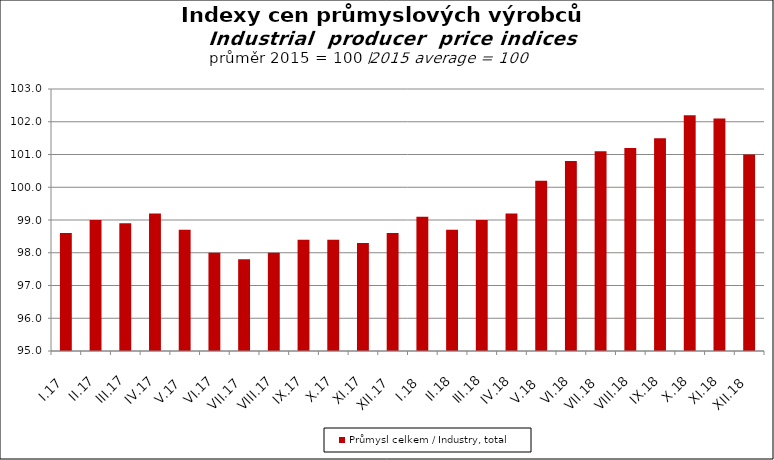
| Category | Průmysl celkem / Industry, total |
|---|---|
| I.17 | 98.6 |
| II.17 | 99 |
| III.17 | 98.9 |
| IV.17 | 99.2 |
| V.17 | 98.7 |
| VI.17 | 98 |
| VII.17 | 97.8 |
| VIII.17 | 98 |
| IX.17 | 98.4 |
| X.17 | 98.4 |
| XI.17 | 98.3 |
| XII.17 | 98.6 |
| I.18 | 99.1 |
| II.18 | 98.7 |
| III.18 | 99 |
| IV.18 | 99.2 |
| V.18 | 100.2 |
| VI.18 | 100.8 |
| VII.18 | 101.1 |
| VIII.18 | 101.2 |
| IX.18 | 101.5 |
| X.18 | 102.2 |
| XI.18 | 102.1 |
| XII.18 | 101 |